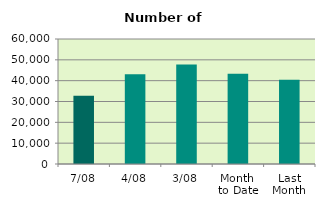
| Category | Series 0 |
|---|---|
| 7/08 | 32758 |
| 4/08 | 43138 |
| 3/08 | 47790 |
| Month 
to Date | 43359.6 |
| Last
Month | 40410.857 |